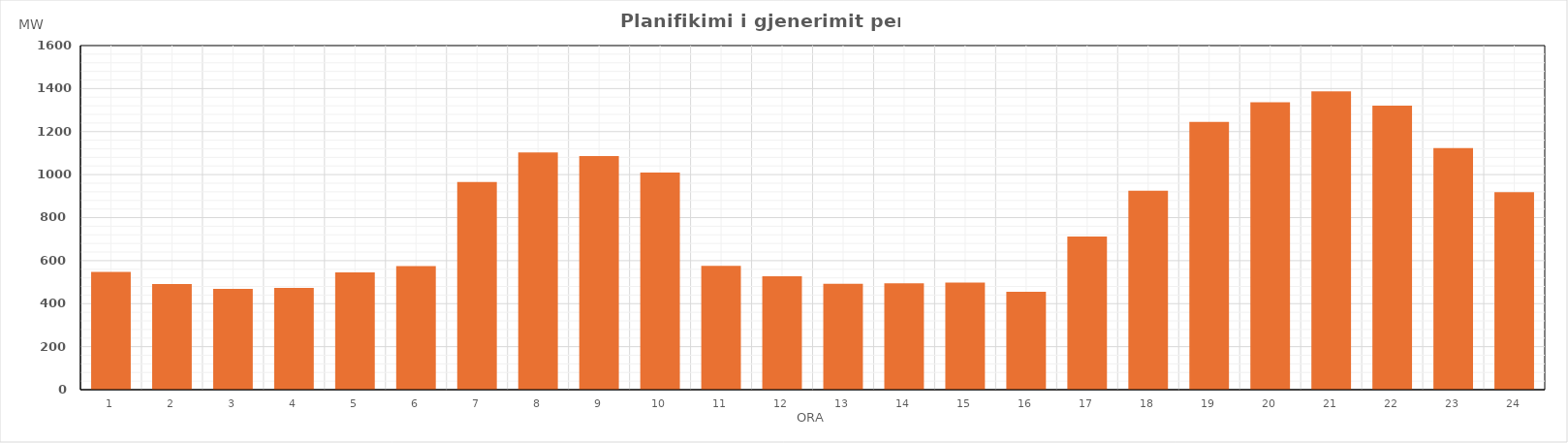
| Category | Max (MW) |
|---|---|
| 0 | 547.13 |
| 1 | 491.81 |
| 2 | 468.41 |
| 3 | 472.72 |
| 4 | 545.44 |
| 5 | 574.73 |
| 6 | 965.22 |
| 7 | 1102.87 |
| 8 | 1086.27 |
| 9 | 1009.07 |
| 10 | 575.73 |
| 11 | 527.52 |
| 12 | 492.05 |
| 13 | 494.72 |
| 14 | 498.02 |
| 15 | 455.42 |
| 16 | 711.95 |
| 17 | 924.58 |
| 18 | 1245.48 |
| 19 | 1336.76 |
| 20 | 1387.2 |
| 21 | 1320.21 |
| 22 | 1123.14 |
| 23 | 918.74 |